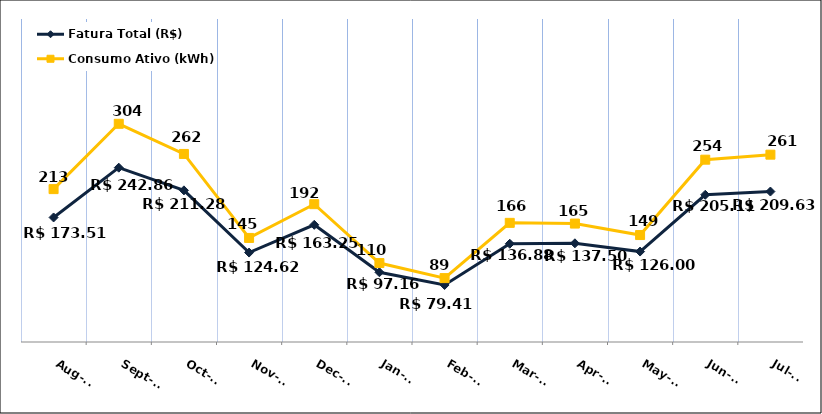
| Category | Fatura Total (R$) | Consumo Ativo (kWh) |
|---|---|---|
| 2023-08-01 | 173.51 | 213 |
| 2023-09-01 | 242.86 | 304 |
| 2023-10-01 | 211.28 | 262 |
| 2023-11-01 | 124.62 | 145 |
| 2023-12-01 | 163.25 | 192 |
| 2024-01-01 | 97.16 | 110 |
| 2024-02-01 | 79.41 | 89 |
| 2024-03-01 | 136.88 | 166 |
| 2024-04-01 | 137.5 | 165 |
| 2024-05-01 | 126 | 149 |
| 2024-06-01 | 205.11 | 254 |
| 2024-07-01 | 209.63 | 261 |